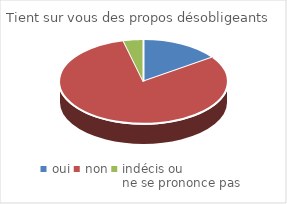
| Category | Tient sur vous des propos désobligeants |
|---|---|
| oui | 12 |
| non | 63 |
| indécis ou 
ne se prononce pas | 3 |